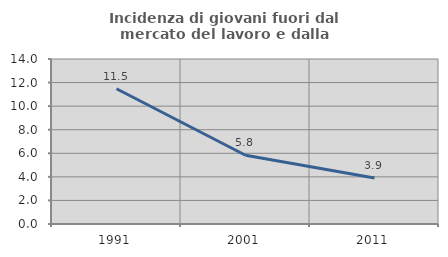
| Category | Incidenza di giovani fuori dal mercato del lavoro e dalla formazione  |
|---|---|
| 1991.0 | 11.475 |
| 2001.0 | 5.833 |
| 2011.0 | 3.906 |